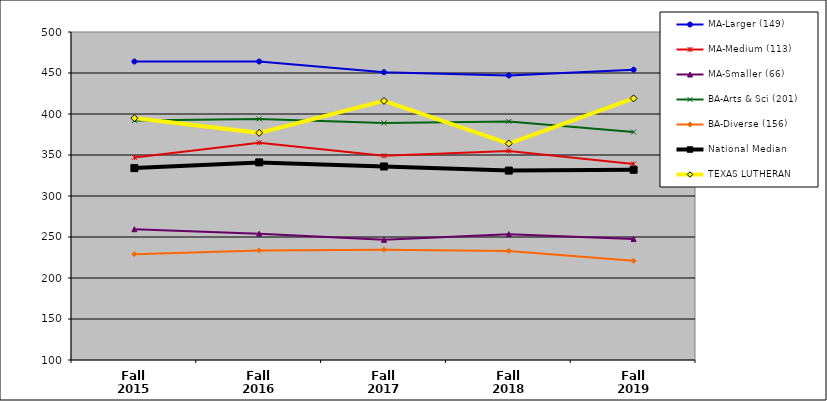
| Category | MA-Larger (149) | MA-Medium (113) | MA-Smaller (66) | BA-Arts & Sci (201) | BA-Diverse (156) | National Median | TEXAS LUTHERAN |
|---|---|---|---|---|---|---|---|
| Fall 2015 | 464 | 347 | 259.5 | 392 | 229 | 334 | 395 |
| Fall 2016 | 464 | 365 | 254 | 394 | 233.5 | 341 | 377 |
| Fall 2017 | 451 | 349 | 246.5 | 389 | 234.5 | 336 | 416 |
| Fall 2018 | 447 | 355 | 253.5 | 391 | 233 | 331 | 364 |
| Fall 2019 | 454 | 339 | 247.5 | 378 | 221 | 332 | 419 |